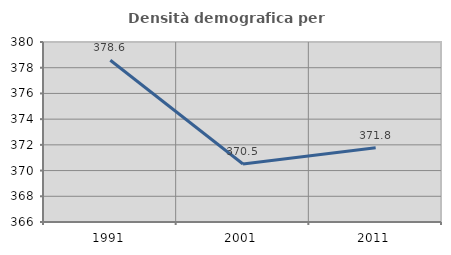
| Category | Densità demografica |
|---|---|
| 1991.0 | 378.582 |
| 2001.0 | 370.514 |
| 2011.0 | 371.775 |